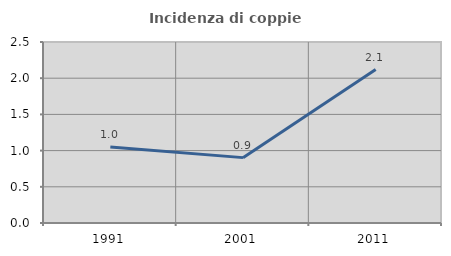
| Category | Incidenza di coppie miste |
|---|---|
| 1991.0 | 1.05 |
| 2001.0 | 0.903 |
| 2011.0 | 2.119 |